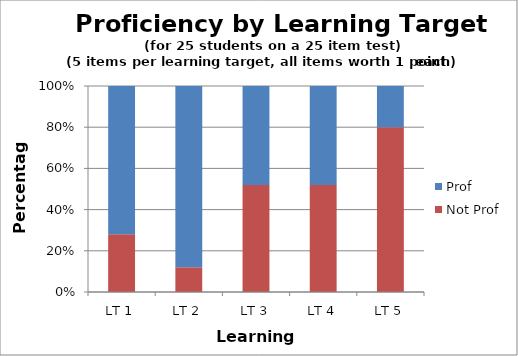
| Category | Not Prof | Prof |
|---|---|---|
| LT 1 | 7 | 18 |
| LT 2 | 3 | 22 |
| LT 3 | 13 | 12 |
| LT 4 | 13 | 12 |
| LT 5 | 20 | 5 |